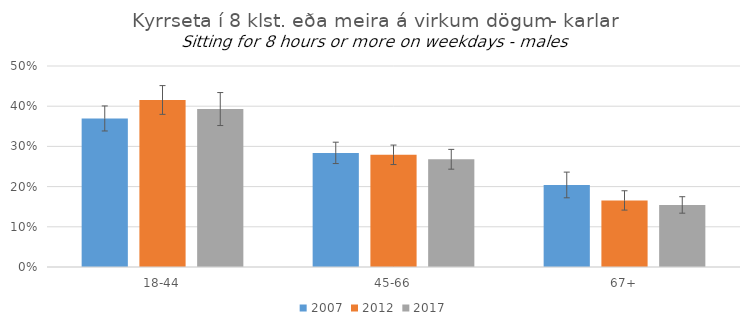
| Category | 2007 | 2012 | 2017 |
|---|---|---|---|
| 18-44 | 0.369 | 0.415 | 0.393 |
| 45-66 | 0.284 | 0.279 | 0.268 |
| 67+ | 0.204 | 0.166 | 0.154 |